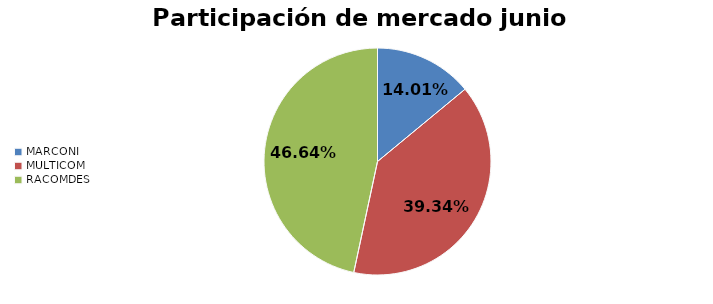
| Category | Series 0 |
|---|---|
| MARCONI | 0.14 |
| MULTICOM | 0.393 |
| RACOMDES | 0.466 |